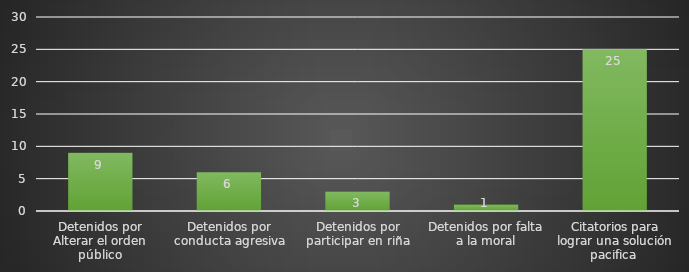
| Category | INDICADOR  |
|---|---|
| Detenidos por Alterar el orden público | 9 |
| Detenidos por conducta agresiva | 6 |
| Detenidos por participar en riña | 3 |
| Detenidos por falta a la moral | 1 |
| Citatorios para lograr una solución pacifica  | 25 |